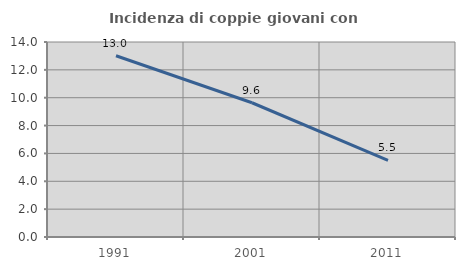
| Category | Incidenza di coppie giovani con figli |
|---|---|
| 1991.0 | 13.016 |
| 2001.0 | 9.639 |
| 2011.0 | 5.505 |